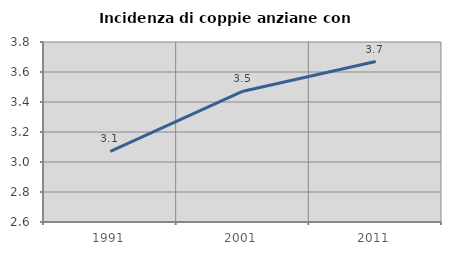
| Category | Incidenza di coppie anziane con figli |
|---|---|
| 1991.0 | 3.07 |
| 2001.0 | 3.472 |
| 2011.0 | 3.67 |